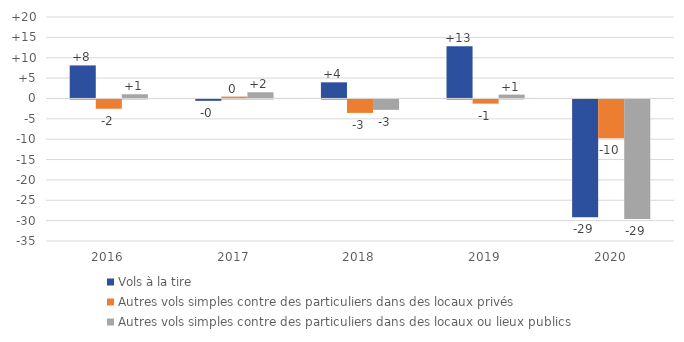
| Category | Vols à la tire | Autres vols simples contre des particuliers dans des locaux privés
 | Autres vols simples contre des particuliers dans des locaux ou lieux publics |
|---|---|---|---|
| 2016.0 | 8.113 | -2.282 | 1.034 |
| 2017.0 | -0.338 | 0.45 | 1.519 |
| 2018.0 | 3.962 | -3.307 | -2.555 |
| 2019.0 | 12.846 | -1.026 | 0.948 |
| 2020.0 | -28.925 | -9.519 | -29.338 |